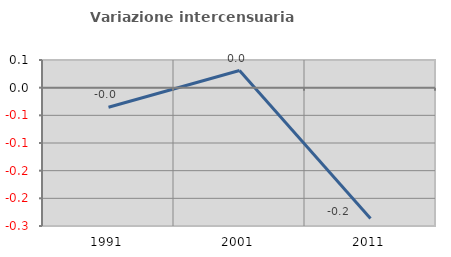
| Category | Variazione intercensuaria annua |
|---|---|
| 1991.0 | -0.035 |
| 2001.0 | 0.031 |
| 2011.0 | -0.236 |